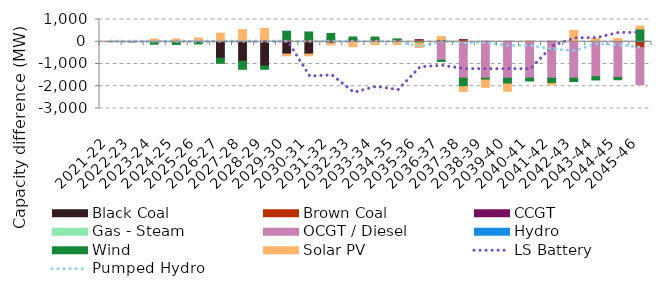
| Category | Black Coal | Brown Coal | CCGT | Gas - Steam | OCGT / Diesel | Hydro | Wind | Solar PV |
|---|---|---|---|---|---|---|---|---|
| 2021-22 | 0 | 0 | 0 | 0 | 0.001 | 0 | 0 | 0.003 |
| 2022-23 | 0 | 0 | 0 | 0 | 0.001 | 0 | 0.011 | -0.004 |
| 2023-24 | 0 | 0 | 0 | 0 | 0.001 | 0 | -110.747 | 125.068 |
| 2024-25 | -10.116 | -0.001 | 0 | 0 | 0.001 | 0 | -112.192 | 125.068 |
| 2025-26 | -28.969 | 46.352 | 0 | 0 | 0.001 | 0 | -67.38 | 124.958 |
| 2026-27 | -738.138 | 46.352 | 0 | 0 | 0.001 | 0 | -231.085 | 340.28 |
| 2027-28 | -877.281 | 43.35 | 0 | 0 | 0.001 | 0 | -359.824 | 504.605 |
| 2028-29 | -1090.33 | 89.615 | 0.001 | 0 | 0.001 | 0 | -146.866 | 504.608 |
| 2029-30 | -553.409 | 89.615 | 0.001 | 0 | 0.001 | 0 | 384.598 | -80.382 |
| 2030-31 | -551.768 | 89.615 | 0.001 | 0 | 0.001 | 0 | 349.047 | -80.381 |
| 2031-32 | -65.402 | 89.615 | 0.001 | 0 | 0.001 | 0 | 283.795 | -80.39 |
| 2032-33 | -28.969 | 89.615 | 0.001 | 0 | 0.001 | 0 | 123.312 | -194.578 |
| 2033-34 | -28.969 | 89.615 | 0.001 | 0 | 0.001 | 0 | 123.274 | -97.951 |
| 2034-35 | -28.969 | 89.615 | 0.001 | 0 | 0.001 | 0 | 39.362 | -97.951 |
| 2035-36 | 0 | 89.615 | 0.001 | 0 | -0.003 | 0 | -51.718 | -208.039 |
| 2036-37 | 0 | 89.615 | 0.001 | 0 | -827.65 | 0 | -57.223 | 152.592 |
| 2037-38 | 0 | 89.615 | 0.001 | 0 | -1636.906 | 0 | -379.744 | -217.475 |
| 2038-39 | 0 | 15.886 | 0.001 | 0 | -1636.906 | 0 | -84.971 | -327.272 |
| 2039-40 | 0 | 15.886 | 0.001 | 0 | -1636.906 | 0 | -261.38 | -327.275 |
| 2040-41 | 0 | 15.886 | 0.001 | 0 | -1636.906 | 0 | -127.951 | 16.701 |
| 2041-42 | 0 | 15.886 | 0.001 | 0 | -1636.905 | 0 | -236.697 | -42.985 |
| 2042-43 | 0 | 15.886 | 0.002 | 0 | -1636.905 | 0 | -149.291 | 493.643 |
| 2043-44 | 0 | 15.886 | 0.002 | 0 | -1569.532 | 0 | -147.322 | 131.835 |
| 2044-45 | 0 | 15.886 | 0.002 | 0 | -1605.12 | 0 | -102.32 | 131.835 |
| 2045-46 | 0 | -261.529 | 0.002 | 0 | -1660.285 | 0 | 572.298 | 131.837 |